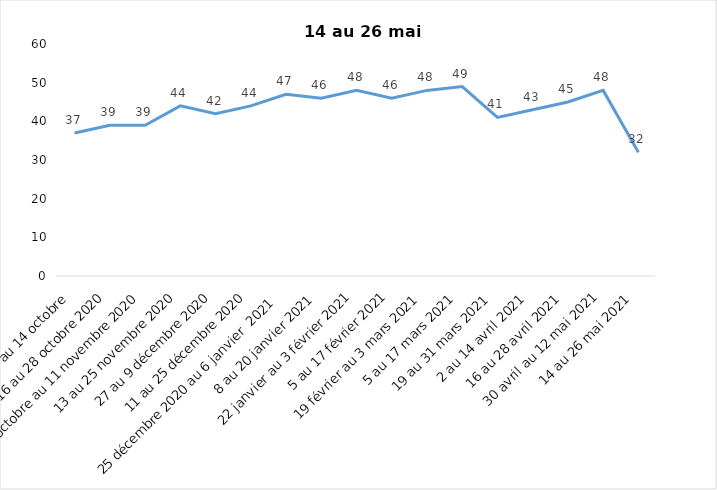
| Category | Toujours aux trois mesures |
|---|---|
| 2 au 14 octobre  | 37 |
| 16 au 28 octobre 2020 | 39 |
| 30 octobre au 11 novembre 2020 | 39 |
| 13 au 25 novembre 2020 | 44 |
| 27 au 9 décembre 2020 | 42 |
| 11 au 25 décembre 2020 | 44 |
| 25 décembre 2020 au 6 janvier  2021 | 47 |
| 8 au 20 janvier 2021 | 46 |
| 22 janvier au 3 février 2021 | 48 |
| 5 au 17 février 2021 | 46 |
| 19 février au 3 mars 2021 | 48 |
| 5 au 17 mars 2021 | 49 |
| 19 au 31 mars 2021 | 41 |
| 2 au 14 avril 2021 | 43 |
| 16 au 28 avril 2021 | 45 |
| 30 avril au 12 mai 2021 | 48 |
| 14 au 26 mai 2021 | 32 |